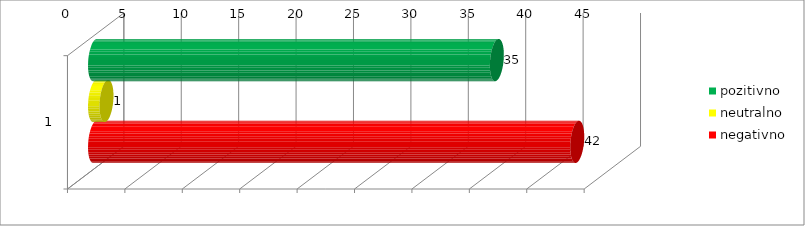
| Category | pozitivno | neutralno | negativno |
|---|---|---|---|
| 0 | 35 | 1 | 42 |